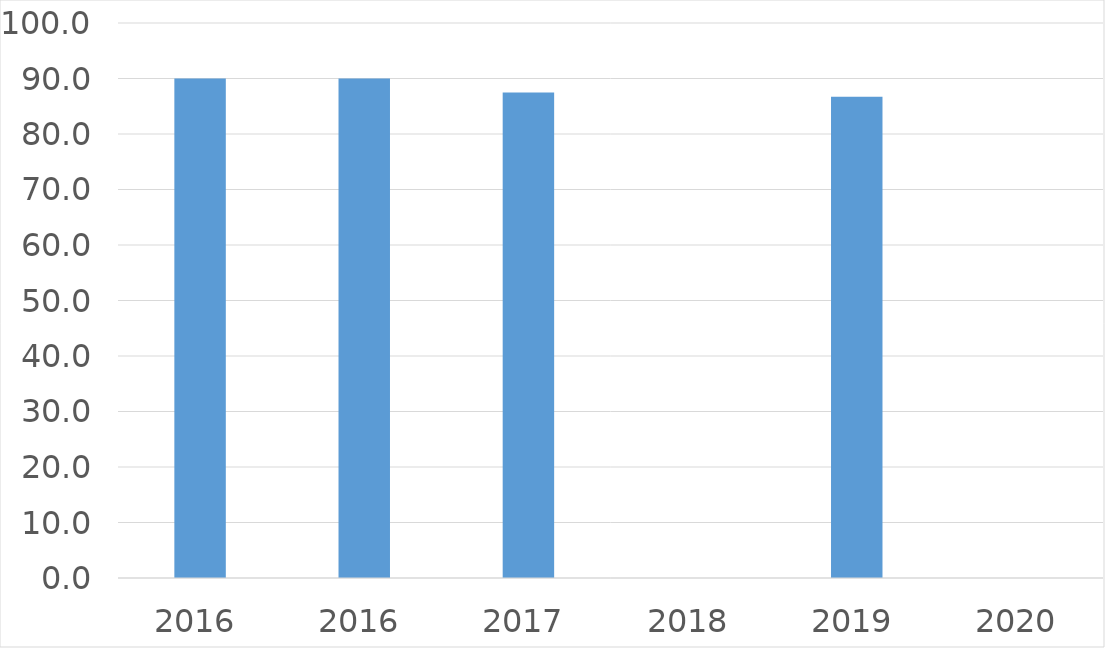
| Category | Series 0 |
|---|---|
| 2016 | 90 |
| 2016 | 90 |
| 2017 | 87.5 |
| 2018 | 0 |
| 2019 | 86.7 |
| 2020 | 0 |